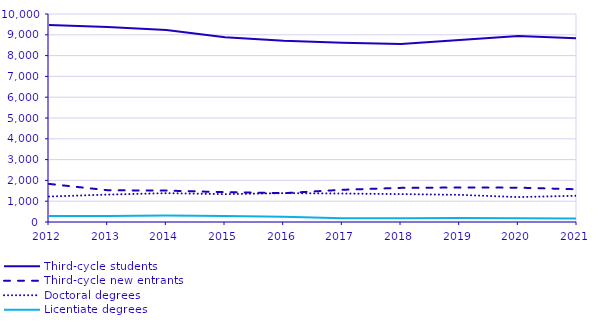
| Category | Third-cycle students | Third-cycle new entrants | Doctoral degrees | Licentiate degrees |
|---|---|---|---|---|
| 2012.0 | 9472 | 1832 | 1224 | 286 |
| 2013.0 | 9371 | 1527 | 1318 | 289 |
| 2014.0 | 9231 | 1510 | 1386 | 309 |
| 2015.0 | 8882 | 1434 | 1338 | 286 |
| 2016.0 | 8717 | 1385 | 1387 | 254 |
| 2017.0 | 8618 | 1549 | 1369 | 179 |
| 2018.0 | 8554 | 1641 | 1341 | 182 |
| 2019.0 | 8748 | 1658 | 1305 | 195 |
| 2020.0 | 8943 | 1651 | 1197 | 177 |
| 2021.0 | 8833 | 1573 | 1263 | 167 |